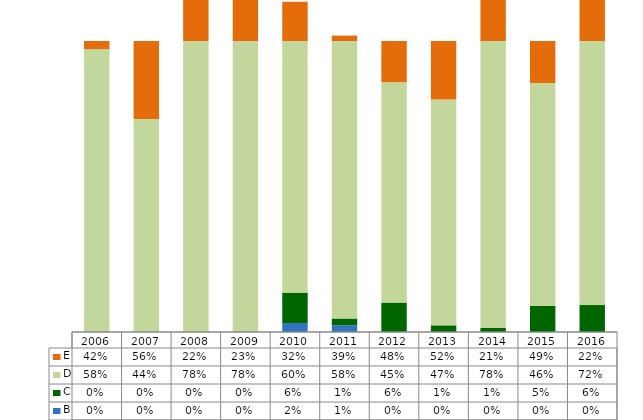
| Category | B | C | D | E |
|---|---|---|---|---|
| 2006.0 | 0 | 0 | 0.583 | 0.417 |
| 2007.0 | 0 | 0 | 0.439 | 0.561 |
| 2008.0 | 0 | 0 | 0.784 | 0.216 |
| 2009.0 | 0 | 0 | 0.775 | 0.225 |
| 2010.0 | 0.018 | 0.063 | 0.6 | 0.319 |
| 2011.0 | 0.014 | 0.014 | 0.583 | 0.389 |
| 2012.0 | 0 | 0.061 | 0.455 | 0.485 |
| 2013.0 | 0 | 0.014 | 0.466 | 0.521 |
| 2014.0 | 0 | 0.008 | 0.782 | 0.21 |
| 2015.0 | 0 | 0.054 | 0.459 | 0.486 |
| 2016.0 | 0 | 0.056 | 0.722 | 0.222 |